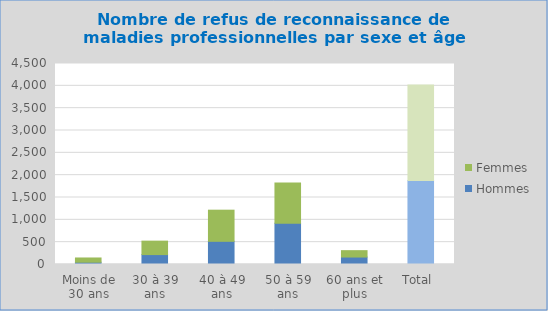
| Category | Hommes | Femmes |
|---|---|---|
| Moins de 30 ans | 51 | 95 |
| 30 à 39 ans | 222 | 301 |
| 40 à 49 ans | 519 | 697 |
| 50 à 59 ans | 922 | 902 |
| 60 ans et plus | 167 | 143 |
| Total  | 1881 | 2138 |